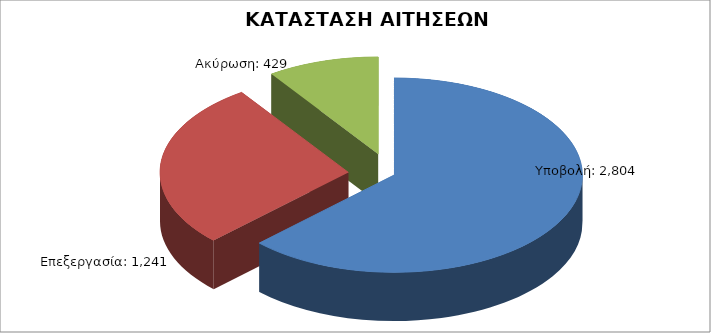
| Category | Series 0 |
|---|---|
| Υποβολή: | 2804 |
| Επεξεργασία: | 1241 |
| Ακύρωση: | 429 |